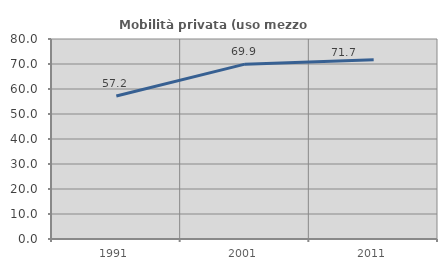
| Category | Mobilità privata (uso mezzo privato) |
|---|---|
| 1991.0 | 57.209 |
| 2001.0 | 69.941 |
| 2011.0 | 71.678 |